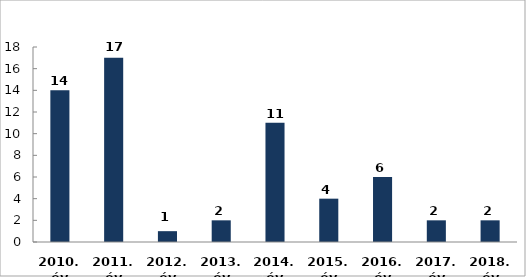
| Category | Külföldiek rendészetével kapcsolatos szabálysértés |
|---|---|
| 2010. év | 14 |
| 2011. év | 17 |
| 2012. év | 1 |
| 2013. év | 2 |
| 2014. év | 11 |
| 2015. év | 4 |
| 2016. év | 6 |
| 2017. év | 2 |
| 2018. év | 2 |